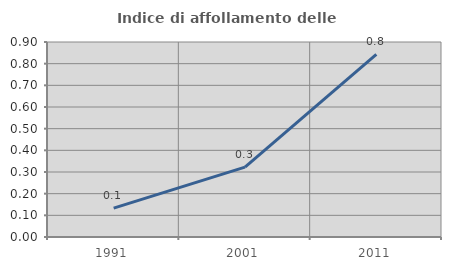
| Category | Indice di affollamento delle abitazioni  |
|---|---|
| 1991.0 | 0.133 |
| 2001.0 | 0.322 |
| 2011.0 | 0.843 |